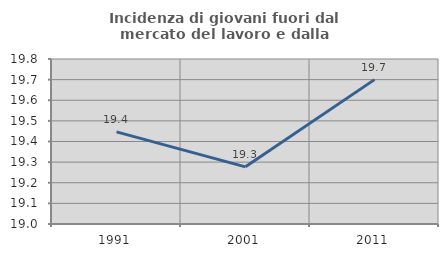
| Category | Incidenza di giovani fuori dal mercato del lavoro e dalla formazione  |
|---|---|
| 1991.0 | 19.446 |
| 2001.0 | 19.277 |
| 2011.0 | 19.7 |